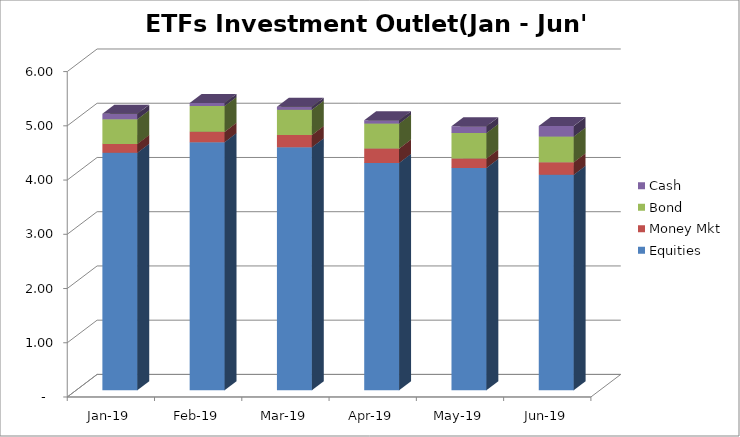
| Category | Equities | Money Mkt | Bond | Cash |
|---|---|---|---|---|
| 2019-01-01 | 4377264283.99 | 163856975.18 | 454756838.17 | 99509145.72 |
| 2019-02-01 | 4574101498.89 | 190249365.75 | 475081203.96 | 56714065.08 |
| 2019-03-01 | 4479173842.33 | 225580048.82 | 467336909.16 | 53276506 |
| 2019-04-01 | 4191729465.72 | 263468874.03 | 460460354.97 | 63029070.21 |
| 2019-05-01 | 4099532871.38 | 172710343.84 | 468805980.48 | 125439511.89 |
| 2019-06-01 | 3972247152.89 | 229299651.51 | 475230363.37 | 192975483.86 |